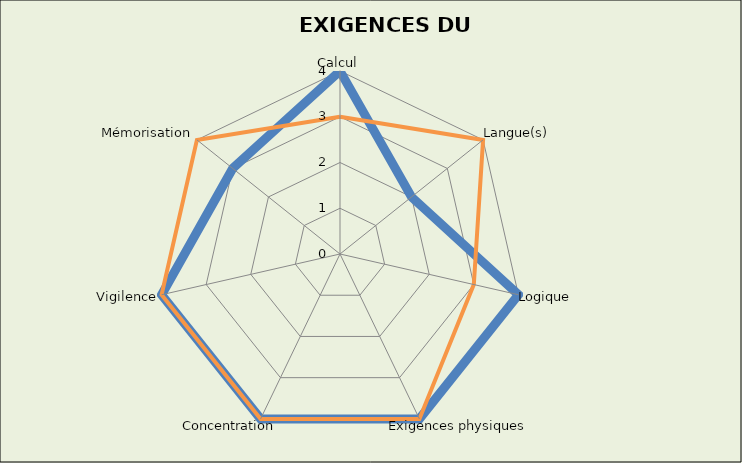
| Category | Series 0 | Series 1 |
|---|---|---|
| Calcul | 4 | 3 |
| Langue(s) | 2 | 4 |
| Logique | 4 | 3 |
| Exigences physiques | 4 | 4 |
| Concentration | 4 | 4 |
| Vigilence | 4 | 4 |
| Mémorisation | 3 | 4 |